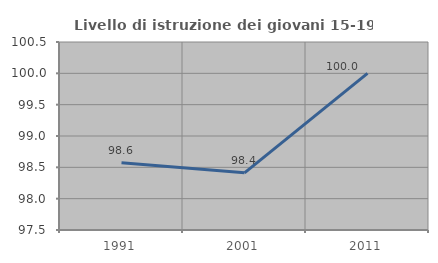
| Category | Livello di istruzione dei giovani 15-19 anni |
|---|---|
| 1991.0 | 98.571 |
| 2001.0 | 98.413 |
| 2011.0 | 100 |